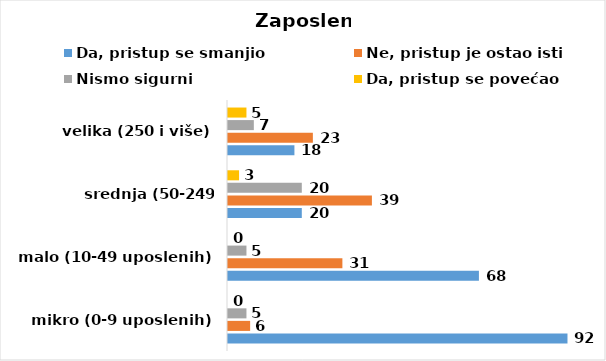
| Category | Da, pristup se smanjio | Ne, pristup je ostao isti | Nismo sigurni | Da, pristup se povećao |
|---|---|---|---|---|
| mikro (0-9 uposlenih) | 92 | 6 | 5 | 0 |
| malo (10-49 uposlenih) | 68 | 31 | 5 | 0 |
| srednja (50-249 uposlenih) | 20 | 39 | 20 | 3 |
| velika (250 i više) | 18 | 23 | 7 | 5 |